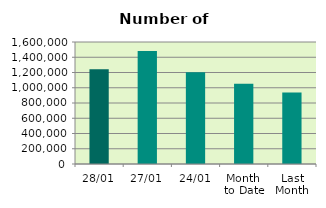
| Category | Series 0 |
|---|---|
| 28/01 | 1244086 |
| 27/01 | 1481000 |
| 24/01 | 1202610 |
| Month 
to Date | 1053050.421 |
| Last
Month | 938735.9 |